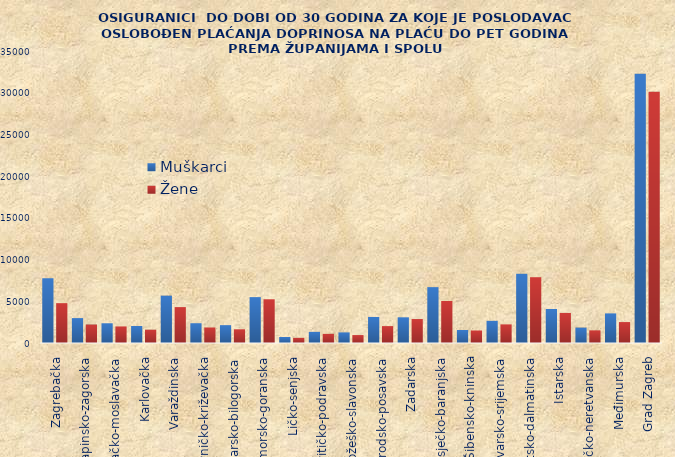
| Category | Muškarci | Žene |
|---|---|---|
| Zagrebačka | 7761 | 4777 |
| Krapinsko-zagorska | 2984 | 2215 |
| Sisačko-moslavačka | 2366 | 1986 |
| Karlovačka | 2040 | 1594 |
| Varaždinska | 5675 | 4303 |
| Koprivničko-križevačka | 2371 | 1859 |
| Bjelovarsko-bilogorska | 2140 | 1643 |
| Primorsko-goranska | 5499 | 5242 |
| Ličko-senjska | 720 | 619 |
| Virovitičko-podravska | 1336 | 1093 |
| Požeško-slavonska | 1271 | 951 |
| Brodsko-posavska | 3121 | 2025 |
| Zadarska | 3080 | 2872 |
| Osječko-baranjska | 6695 | 5034 |
| Šibensko-kninska | 1557 | 1500 |
| Vukovarsko-srijemska | 2656 | 2231 |
| Splitsko-dalmatinska | 8297 | 7886 |
| Istarska | 4077 | 3605 |
| Dubrovačko-neretvanska | 1846 | 1516 |
| Međimurska | 3550 | 2509 |
| Grad Zagreb | 32259 | 30108 |